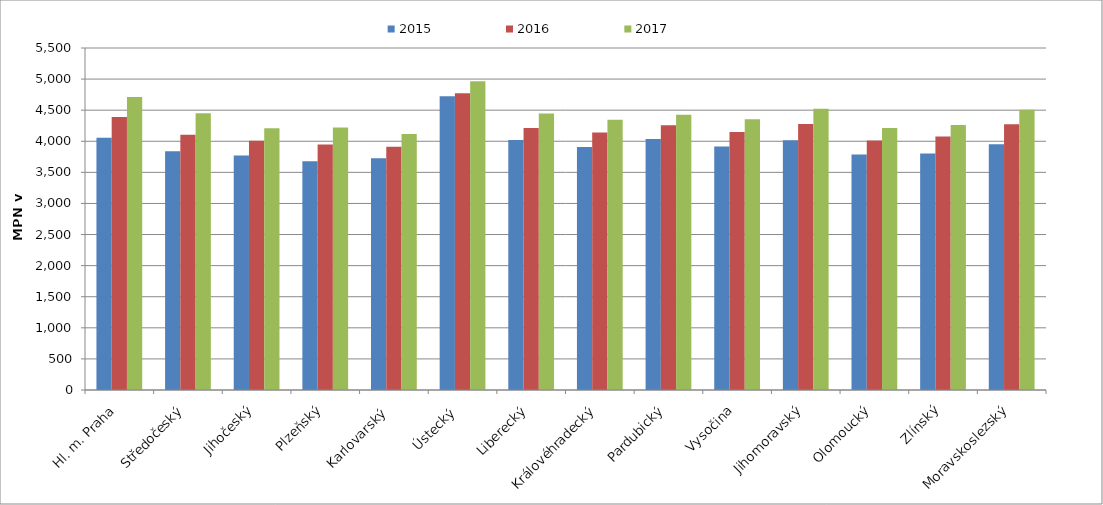
| Category | 2015 | 2016 | 2017 |
|---|---|---|---|
| Hl. m. Praha | 4054.858 | 4391.653 | 4710.346 |
| Středočeský | 3838.235 | 4104.07 | 4450.71 |
| Jihočeský | 3771.827 | 4009.539 | 4209.487 |
| Plzeňský | 3679.144 | 3947.135 | 4223.377 |
| Karlovarský  | 3726.074 | 3913.228 | 4117.397 |
| Ústecký   | 4723.373 | 4773.59 | 4964.414 |
| Liberecký | 4021.352 | 4213.294 | 4446.143 |
| Královéhradecký | 3906.433 | 4140.745 | 4347.63 |
| Pardubický | 4038.452 | 4256.912 | 4427.393 |
| Vysočina | 3915.716 | 4147.206 | 4354.531 |
| Jihomoravský | 4015.568 | 4277.883 | 4522.228 |
| Olomoucký | 3785.553 | 4012.754 | 4213.544 |
| Zlínský | 3804.536 | 4078.631 | 4259.769 |
| Moravskoslezský | 3952.491 | 4272.306 | 4505.214 |